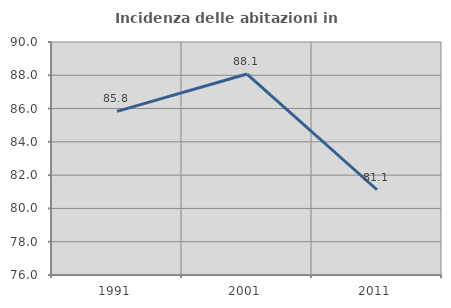
| Category | Incidenza delle abitazioni in proprietà  |
|---|---|
| 1991.0 | 85.829 |
| 2001.0 | 88.076 |
| 2011.0 | 81.122 |